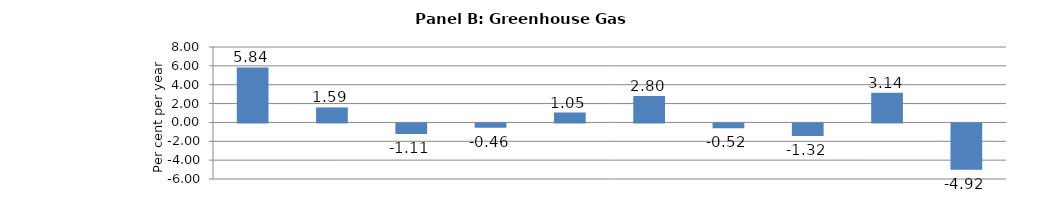
| Category | Series 0 |
|---|---|
| Paper manufacturing | 5.836 |
| Crop and animal production | 1.594 |
| Wood product manufacturing | -1.112 |
| Forestry and logging | -0.457 |
| Fishing, hunting and trapping | 1.05 |
| Petroleum and coal products manufacturing | 2.799 |
| Support activities for mining and oil and gas | -0.522 |
| Oil and gas extraction | -1.322 |
| Mining (except oil and gas) | 3.145 |
| Support activities for agriculture and forestry | -4.918 |